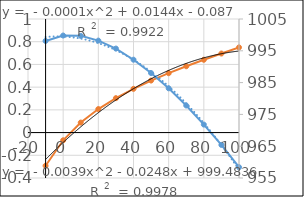
| Category | Series 1 |
|---|---|
| -10.0 | -0.292 |
| 0.0 | -0.068 |
| 10.0 | 0.088 |
| 20.0 | 0.207 |
| 30.0 | 0.303 |
| 40.0 | 0.385 |
| 50.0 | 0.458 |
| 60.0 | 0.523 |
| 70.0 | 0.584 |
| 80.0 | 0.641 |
| 90.0 | 0.696 |
| 100.0 | 0.75 |